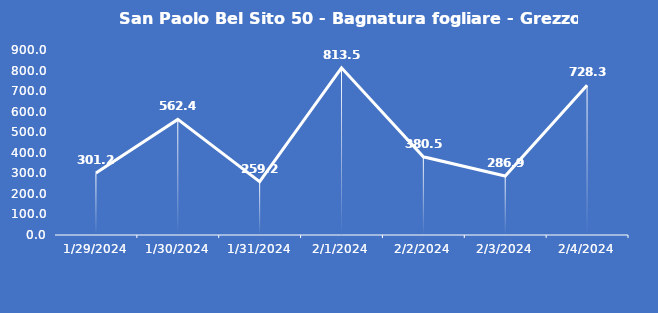
| Category | San Paolo Bel Sito 50 - Bagnatura fogliare - Grezzo (min) |
|---|---|
| 1/29/24 | 301.2 |
| 1/30/24 | 562.4 |
| 1/31/24 | 259.2 |
| 2/1/24 | 813.5 |
| 2/2/24 | 380.5 |
| 2/3/24 | 286.9 |
| 2/4/24 | 728.3 |